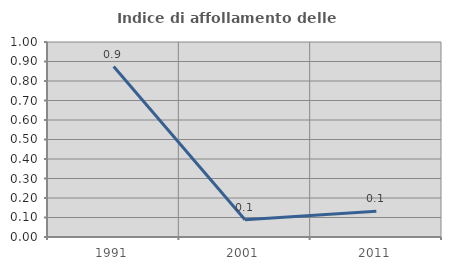
| Category | Indice di affollamento delle abitazioni  |
|---|---|
| 1991.0 | 0.874 |
| 2001.0 | 0.089 |
| 2011.0 | 0.131 |